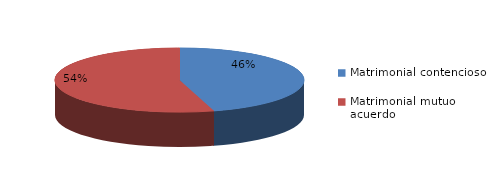
| Category | Series 0 |
|---|---|
| 0 | 312 |
| 1 | 373 |